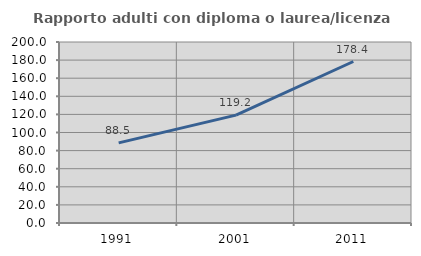
| Category | Rapporto adulti con diploma o laurea/licenza media  |
|---|---|
| 1991.0 | 88.494 |
| 2001.0 | 119.225 |
| 2011.0 | 178.447 |